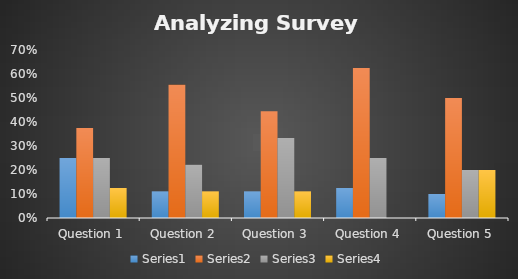
| Category | Series 0 | Series 1 | Series 2 | Series 3 |
|---|---|---|---|---|
| Question 1 | 0.25 | 0.375 | 0.25 | 0.125 |
| Question 2 | 0.111 | 0.556 | 0.222 | 0.111 |
| Question 3 | 0.111 | 0.444 | 0.333 | 0.111 |
| Question 4 | 0.125 | 0.625 | 0.25 | 0 |
| Question 5 | 0.1 | 0.5 | 0.2 | 0.2 |